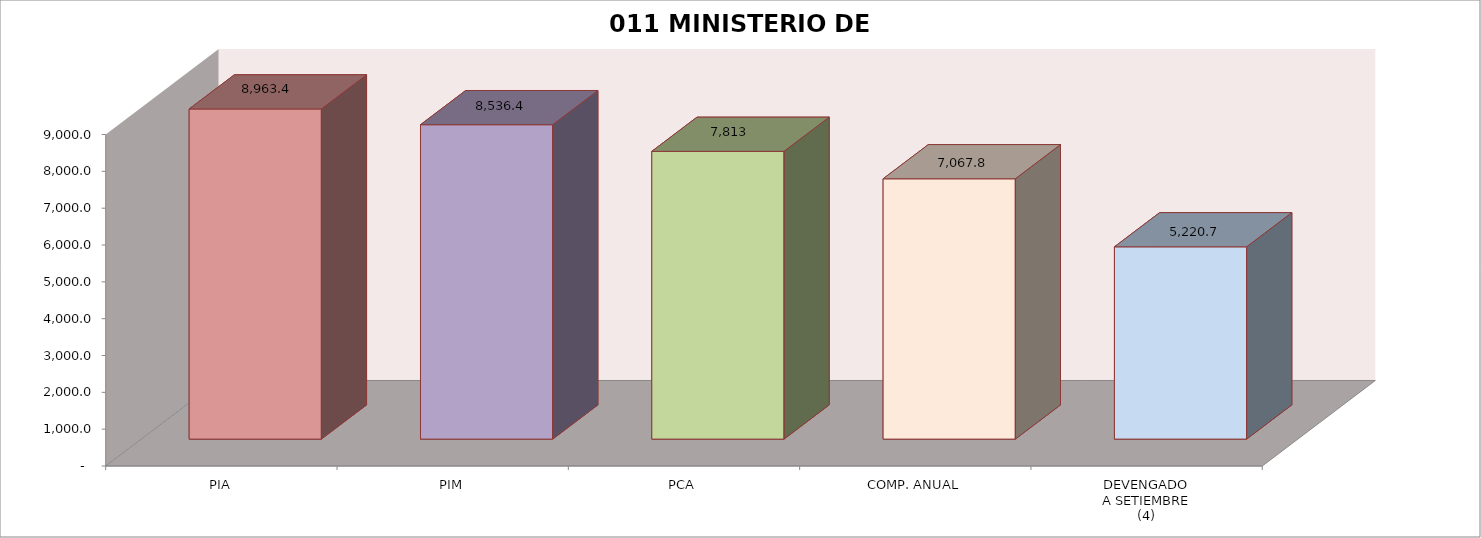
| Category | 011 MINISTERIO DE SALUD |
|---|---|
| PIA | 8963.39 |
| PIM | 8536.417 |
| PCA | 7812.784 |
| COMP. ANUAL | 7067.792 |
| DEVENGADO
A SETIEMBRE
(4) | 5220.733 |